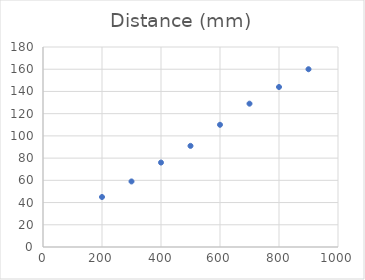
| Category | Distance (mm) |
|---|---|
| 200.0 | 45 |
| 300.0 | 59 |
| 400.0 | 76 |
| 500.0 | 91 |
| 600.0 | 110 |
| 700.0 | 129 |
| 800.0 | 144 |
| 900.0 | 160 |